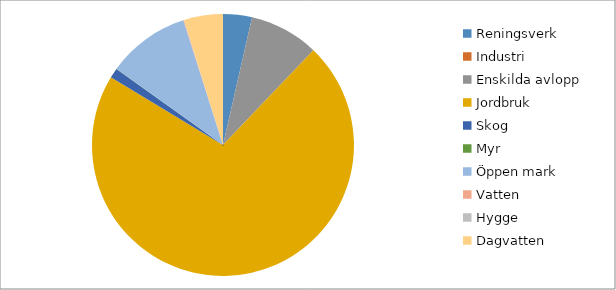
| Category | Series 1 | Series 0 |
|---|---|---|
| Reningsverk | 502.13 | 502.13 |
| Industri | 0 | 0 |
| Enskilda avlopp | 1205 | 1205 |
| Jordbruk | 10078 | 10078 |
| Skog | 172 | 172 |
| Myr | 2 | 2 |
| Öppen mark | 1440 | 1440 |
| Vatten | 11 | 11 |
| Hygge  | 4 | 4 |
| Dagvatten | 675 | 675 |